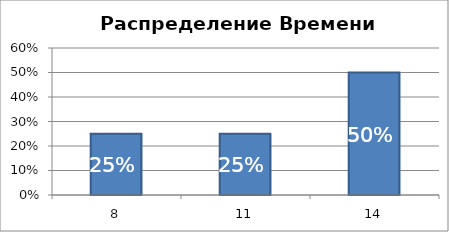
| Category | 25% 25% 50% |
|---|---|
| 8.0 | 0.25 |
| 11.0 | 0.25 |
| 14.0 | 0.5 |